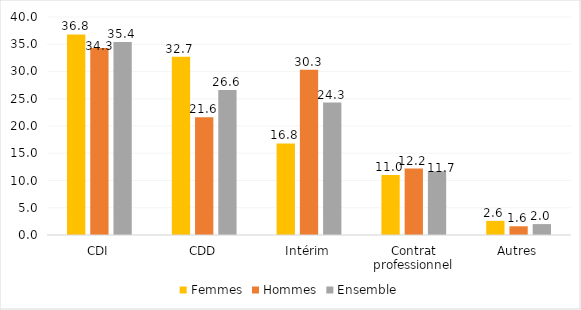
| Category | Femmes | Hommes | Ensemble |
|---|---|---|---|
| CDI | 36.8 | 34.3 | 35.4 |
| CDD | 32.7 | 21.6 | 26.6 |
| Intérim | 16.8 | 30.3 | 24.3 |
| Contrat professionnel | 11 | 12.2 | 11.7 |
| Autres | 2.6 | 1.6 | 2 |